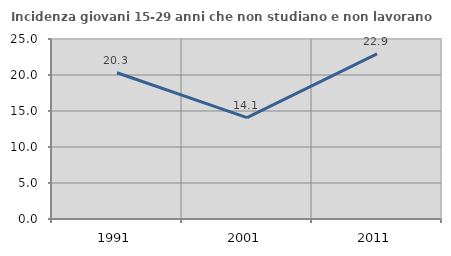
| Category | Incidenza giovani 15-29 anni che non studiano e non lavorano  |
|---|---|
| 1991.0 | 20.312 |
| 2001.0 | 14.09 |
| 2011.0 | 22.922 |